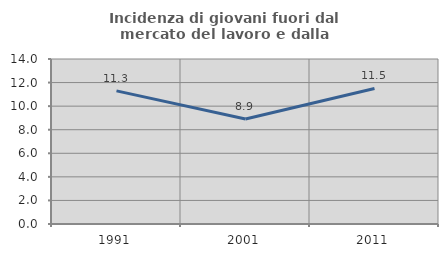
| Category | Incidenza di giovani fuori dal mercato del lavoro e dalla formazione  |
|---|---|
| 1991.0 | 11.293 |
| 2001.0 | 8.903 |
| 2011.0 | 11.501 |